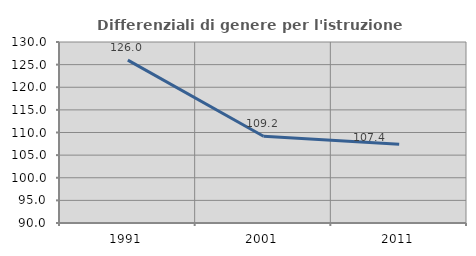
| Category | Differenziali di genere per l'istruzione superiore |
|---|---|
| 1991.0 | 125.998 |
| 2001.0 | 109.177 |
| 2011.0 | 107.424 |